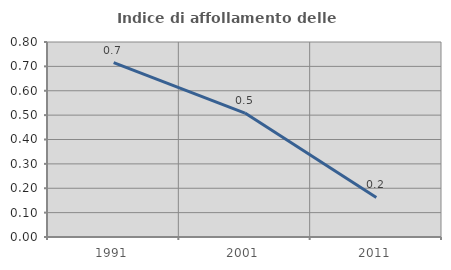
| Category | Indice di affollamento delle abitazioni  |
|---|---|
| 1991.0 | 0.716 |
| 2001.0 | 0.508 |
| 2011.0 | 0.162 |